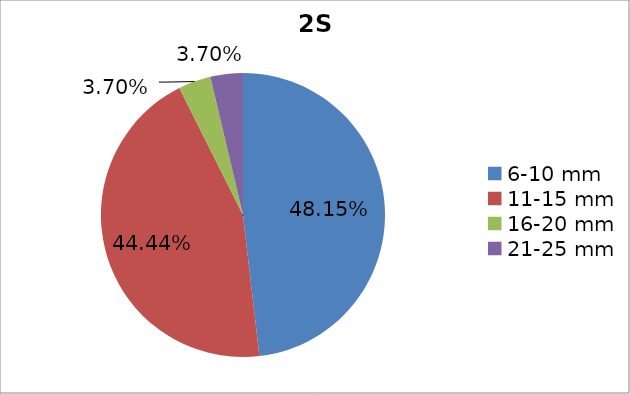
| Category | Series 0 |
|---|---|
| 6-10 mm | 0.482 |
| 11-15 mm | 0.444 |
| 16-20 mm | 0.037 |
| 21-25 mm | 0.037 |